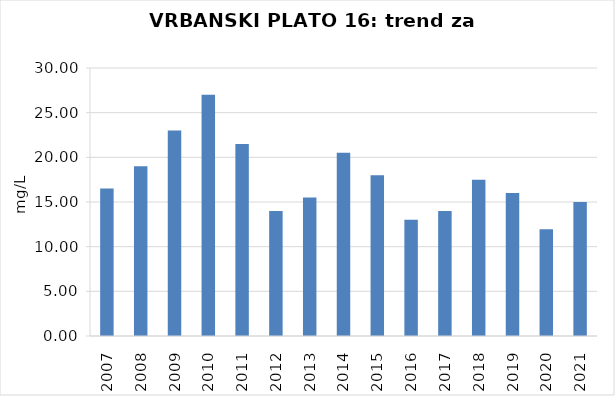
| Category | Vsota |
|---|---|
| 2007 | 16.5 |
| 2008 | 19 |
| 2009 | 23 |
| 2010 | 27 |
| 2011 | 21.5 |
| 2012 | 14 |
| 2013 | 15.5 |
| 2014 | 20.5 |
| 2015 | 18 |
| 2016 | 13 |
| 2017 | 14 |
| 2018 | 17.5 |
| 2019 | 16 |
| 2020 | 11.95 |
| 2021 | 15 |